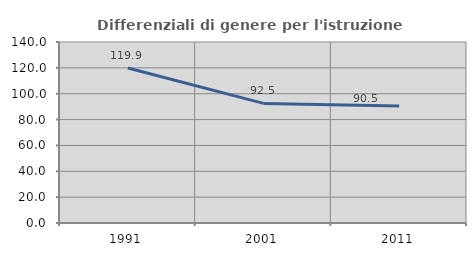
| Category | Differenziali di genere per l'istruzione superiore |
|---|---|
| 1991.0 | 119.899 |
| 2001.0 | 92.518 |
| 2011.0 | 90.527 |